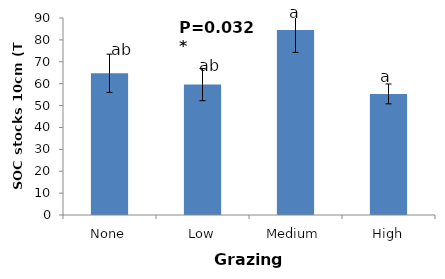
| Category | Series 0 |
|---|---|
| None | 64.742 |
| Low | 59.592 |
| Medium | 84.529 |
| High | 55.316 |